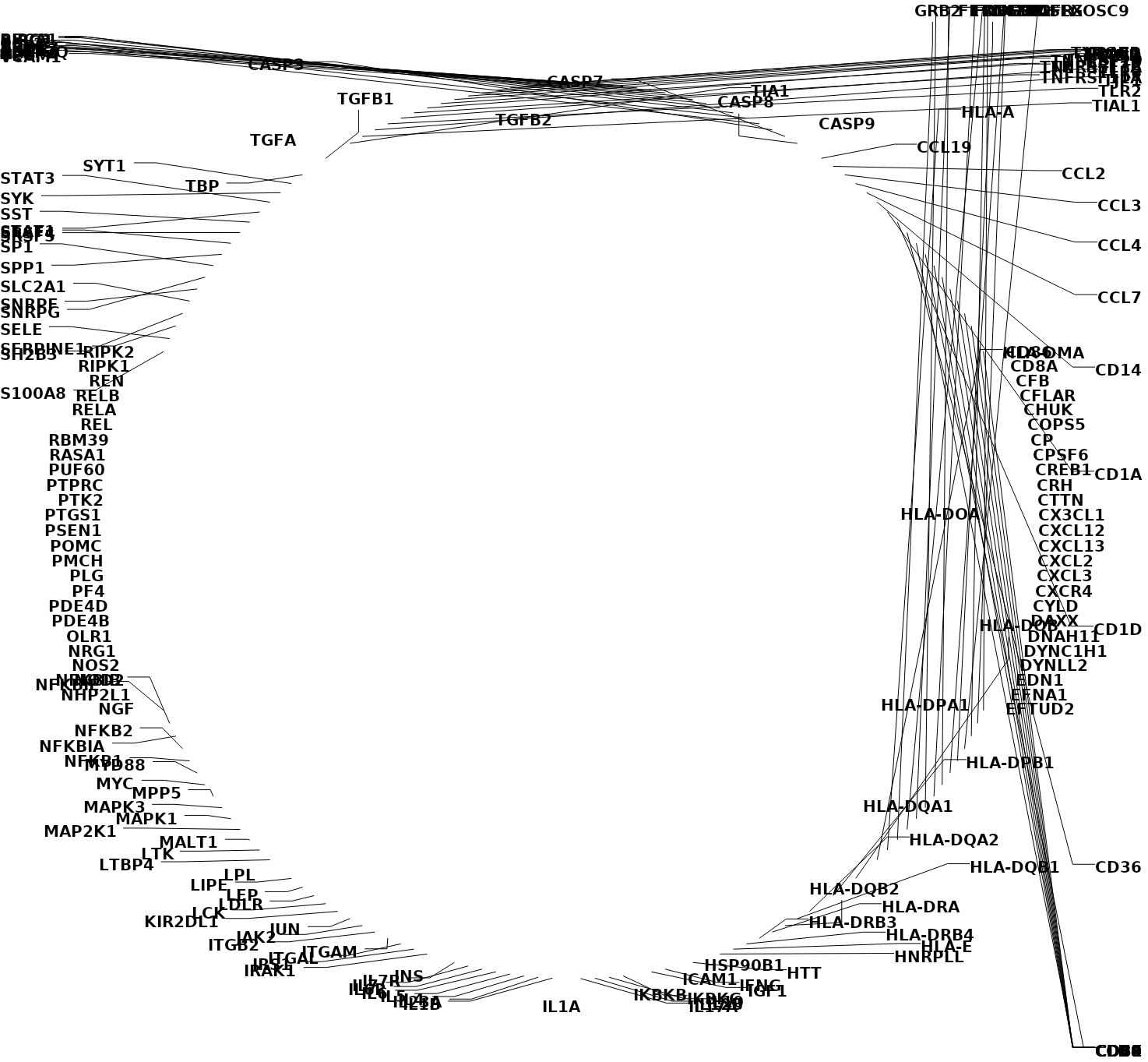
| Category | Series 0 |
|---|---|
| ACE | 1 |
| ADIPOQ | 1 |
| AGT | 1 |
| AKT1 | 1 |
| ALB | 1 |
| APCS | 1 |
| APOC3 | 1 |
| APP | 1 |
| BCL2 | 1 |
| BIRC2 | 1 |
| BIRC3 | 1 |
| BRCA1 | 1 |
| C5 | 1 |
| CASP2 | 1 |
| CASP3 | 1 |
| CASP7 | 1 |
| CASP8 | 1 |
| CASP9 | 1 |
| CCL19 | 1 |
| CCL2 | 1 |
| CCL3 | 1 |
| CCL4 | 1 |
| CCL7 | 1 |
| CD14 | 1 |
| CD1A | 1 |
| CD1D | 1 |
| CD36 | 1 |
| CD3E | 1 |
| CD4 | 1 |
| CD40 | 1 |
| CD44 | 1 |
| CD59 | 1 |
| CD68 | 1 |
| CD69 | 1 |
| CD74 | 1 |
| CD80 | 1 |
| CD83 | 1 |
| CD86 | 1 |
| CD8A | 1 |
| CFB | 1 |
| CFLAR | 1 |
| CHUK | 1 |
| COPS5 | 1 |
| CP | 1 |
| CPSF6 | 1 |
| CREB1 | 1 |
| CRH | 1 |
| CTTN | 1 |
| CX3CL1 | 1 |
| CXCL12 | 1 |
| CXCL13 | 1 |
| CXCL2 | 1 |
| CXCL3 | 1 |
| CXCR4 | 1 |
| CYLD | 1 |
| DAXX | 1 |
| DNAH11 | 1 |
| DYNC1H1 | 1 |
| DYNLL2 | 1 |
| EDN1 | 1 |
| EFNA1 | 1 |
| EFTUD2 | 1 |
| EGF | 1 |
| EGFR | 1 |
| ESR2 | 1 |
| EXOSC9 | 1 |
| FADD | 1 |
| FASLG | 1 |
| FBN1 | 1 |
| FGF2 | 1 |
| FLT1 | 1 |
| FOS | 1 |
| GHRH | 1 |
| GRB2 | 1 |
| HLA-A | 1 |
| HLA-DMA | 1 |
| HLA-DOA | 1 |
| HLA-DOB | 1 |
| HLA-DPA1 | 1 |
| HLA-DPB1 | 1 |
| HLA-DQA1 | 1 |
| HLA-DQA2 | 1 |
| HLA-DQB1 | 1 |
| HLA-DQB2 | 1 |
| HLA-DRA | 1 |
| HLA-DRB3 | 1 |
| HLA-DRB4 | 1 |
| HLA-E | 1 |
| HNRPLL | 1 |
| HSP90B1 | 1 |
| HTT | 1 |
| ICAM1 | 1 |
| IFNG | 1 |
| IGF1 | 1 |
| IKBKB | 1 |
| IKBKG | 1 |
| IL10 | 1 |
| IL12B | 1 |
| IL17A | 1 |
| IL1A | 1 |
| IL1B | 1 |
| IL23A | 1 |
| IL4 | 1 |
| IL5 | 1 |
| IL6 | 1 |
| IL6R | 1 |
| IL7 | 1 |
| IL7R | 1 |
| INS | 1 |
| IRAK1 | 1 |
| IRS1 | 1 |
| ITGAL | 1 |
| ITGAM | 1 |
| ITGB2 | 1 |
| JAK2 | 1 |
| JUN | 1 |
| KIR2DL1 | 1 |
| LCK | 1 |
| LDLR | 1 |
| LEP | 1 |
| LIPE | 1 |
| LPL | 1 |
| LTBP4 | 1 |
| LTK | 1 |
| MALT1 | 1 |
| MAP2K1 | 1 |
| MAPK1 | 1 |
| MAPK3 | 1 |
| MPP5 | 1 |
| MYC | 1 |
| MYD88 | 1 |
| NFKB1 | 1 |
| NFKB2 | 1 |
| NFKBIA | 1 |
| NFKBIB | 1 |
| NFKBIE | 1 |
| NGF | 1 |
| NHP2L1 | 1 |
| NOD2 | 1 |
| NOS2 | 1 |
| NRG1 | 1 |
| OLR1 | 1 |
| PDE4B | 1 |
| PDE4D | 1 |
| PF4 | 1 |
| PLG | 1 |
| PMCH | 1 |
| POMC | 1 |
| PSEN1 | 1 |
| PTGS1 | 1 |
| PTK2 | 1 |
| PTPRC | 1 |
| PUF60 | 1 |
| RASA1 | 1 |
| RBM39 | 1 |
| REL | 1 |
| RELA | 1 |
| RELB | 1 |
| REN | 1 |
| RIPK1 | 1 |
| RIPK2 | 1 |
| S100A8 | 1 |
| SELE | 1 |
| SERPINE1 | 1 |
| SH2B3 | 1 |
| SLC2A1 | 1 |
| SNRPF | 1 |
| SNRPG | 1 |
| SP1 | 1 |
| SPP1 | 1 |
| SRSF4 | 1 |
| SRSF5 | 1 |
| SST | 1 |
| STAT1 | 1 |
| STAT3 | 1 |
| SYK | 1 |
| SYT1 | 1 |
| TBP | 1 |
| TGFA | 1 |
| TGFB1 | 1 |
| TGFB2 | 1 |
| TIA1 | 1 |
| TIAL1 | 1 |
| TJP1 | 1 |
| TLR2 | 1 |
| TLR6 | 1 |
| TNFRSF11A | 1 |
| TNFRSF11B | 1 |
| TNFRSF1A | 1 |
| TNFRSF1B | 1 |
| TNFSF10 | 1 |
| TP53 | 1 |
| TRADD | 1 |
| TRAF1 | 1 |
| TYROBP | 1 |
| U2AF1 | 1 |
| VCAM1 | 1 |
| VEGFA | 1 |